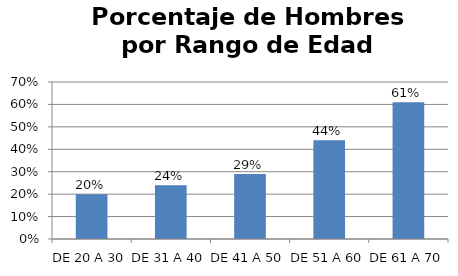
| Category | Porcentaje |
|---|---|
| DE 20 A 30 | 0.2 |
| DE 31 A 40 | 0.24 |
| DE 41 A 50 | 0.29 |
| DE 51 A 60 | 0.44 |
| DE 61 A 70 | 0.61 |